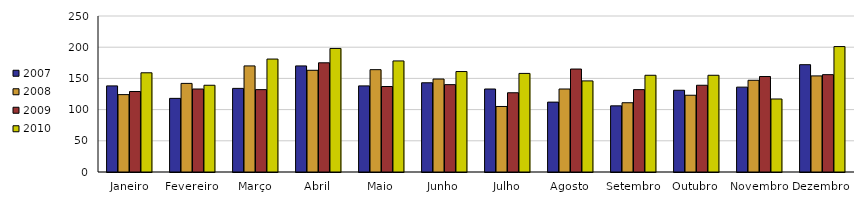
| Category | 2007 | 2008 | 2009 | 2010 |
|---|---|---|---|---|
| Janeiro | 138 | 124 | 129 | 159 |
| Fevereiro | 118 | 142 | 133 | 139 |
| Março | 134 | 170 | 132 | 181 |
| Abril | 170 | 163 | 175 | 198 |
| Maio | 138 | 164 | 137 | 178 |
| Junho | 143 | 149 | 140 | 161 |
| Julho | 133 | 105 | 127 | 158 |
| Agosto | 112 | 133 | 165 | 146 |
| Setembro | 106 | 111 | 132 | 155 |
| Outubro | 131 | 123 | 139 | 155 |
| Novembro | 136 | 147 | 153 | 117 |
| Dezembro | 172 | 154 | 156 | 201 |